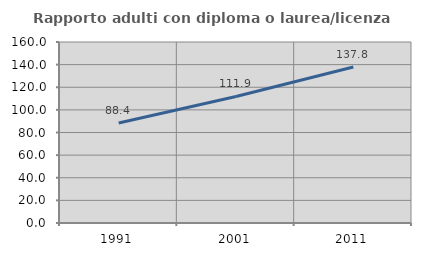
| Category | Rapporto adulti con diploma o laurea/licenza media  |
|---|---|
| 1991.0 | 88.36 |
| 2001.0 | 111.875 |
| 2011.0 | 137.833 |